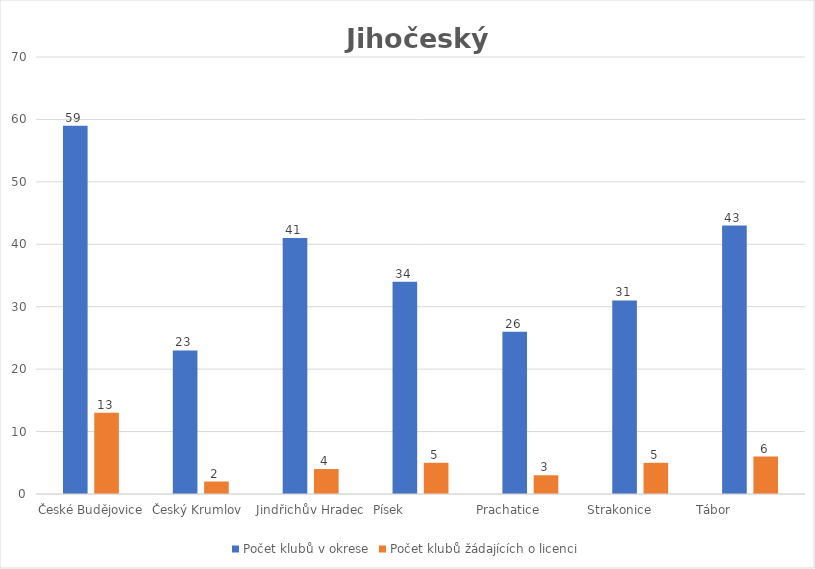
| Category | Počet klubů v okrese | Počet klubů žádajících o licenci |
|---|---|---|
| České Budějovice | 59 | 13 |
| Český Krumlov  | 23 | 2 |
| Jindřichův Hradec | 41 | 4 |
| Písek                 | 34 | 5 |
| Prachatice             | 26 | 3 |
| Strakonice           | 31 | 5 |
| Tábor                    | 43 | 6 |